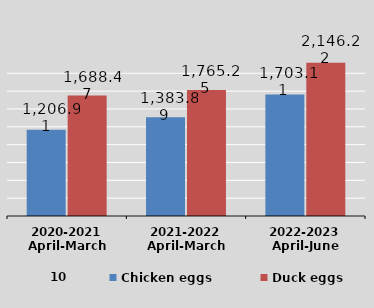
| Category | Chicken eggs | Duck eggs |
|---|---|---|
| 2020-2021
April-March
 | 1206.908 | 1688.467 |
| 2021-2022
April-March
 | 1383.893 | 1765.249 |
| 2022-2023
April-June

 | 1703.112 | 2146.218 |